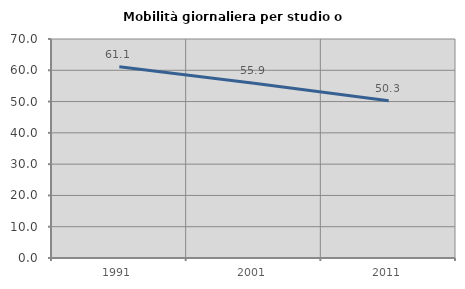
| Category | Mobilità giornaliera per studio o lavoro |
|---|---|
| 1991.0 | 61.111 |
| 2001.0 | 55.856 |
| 2011.0 | 50.259 |